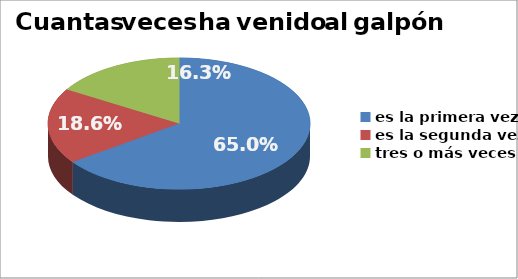
| Category | Series 0 |
|---|---|
| es la primera vez | 0.65 |
| es la segunda vez | 0.186 |
| tres o más veces | 0.163 |